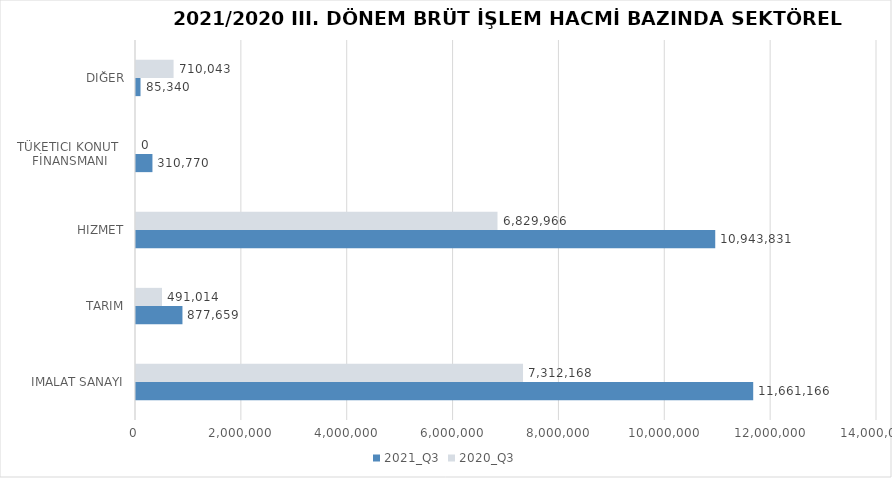
| Category | 2021_Q3 | 2020_Q3 |
|---|---|---|
| İMALAT SANAYİ | 11661165.52 | 7312168.18 |
| TARIM | 877659.164 | 491013.571 |
| HİZMET | 10943830.592 | 6829966.082 |
| TÜKETİCİ KONUT 
FİNANSMANI | 310770 | 0 |
| DİĞER | 85340 | 710043.38 |